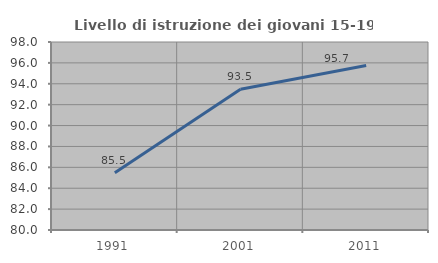
| Category | Livello di istruzione dei giovani 15-19 anni |
|---|---|
| 1991.0 | 85.484 |
| 2001.0 | 93.478 |
| 2011.0 | 95.745 |